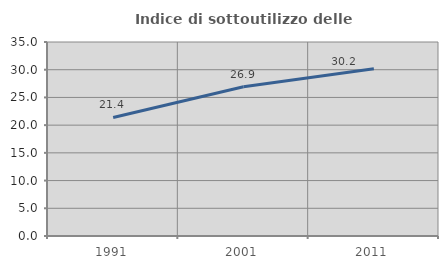
| Category | Indice di sottoutilizzo delle abitazioni  |
|---|---|
| 1991.0 | 21.392 |
| 2001.0 | 26.928 |
| 2011.0 | 30.181 |